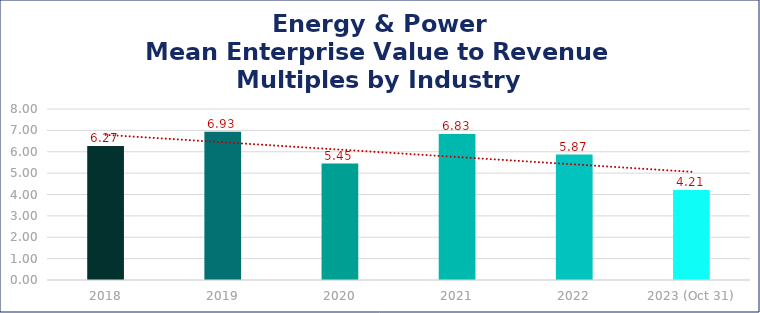
| Category | Energy & Power |
|---|---|
| 2018 | 6.27 |
| 2019 | 6.93 |
| 2020 | 5.45 |
| 2021 | 6.83 |
| 2022 | 5.87 |
| 2023 (Oct 31) | 4.21 |